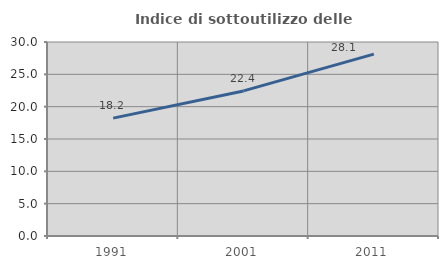
| Category | Indice di sottoutilizzo delle abitazioni  |
|---|---|
| 1991.0 | 18.232 |
| 2001.0 | 22.435 |
| 2011.0 | 28.128 |